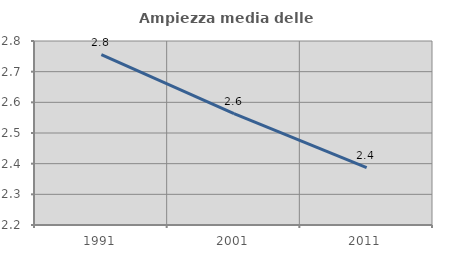
| Category | Ampiezza media delle famiglie |
|---|---|
| 1991.0 | 2.756 |
| 2001.0 | 2.563 |
| 2011.0 | 2.387 |